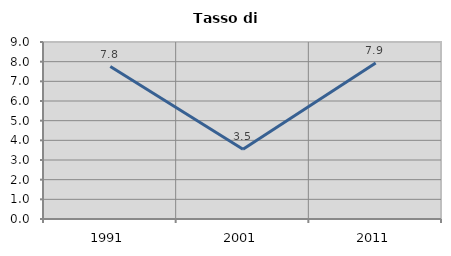
| Category | Tasso di disoccupazione   |
|---|---|
| 1991.0 | 7.753 |
| 2001.0 | 3.546 |
| 2011.0 | 7.937 |